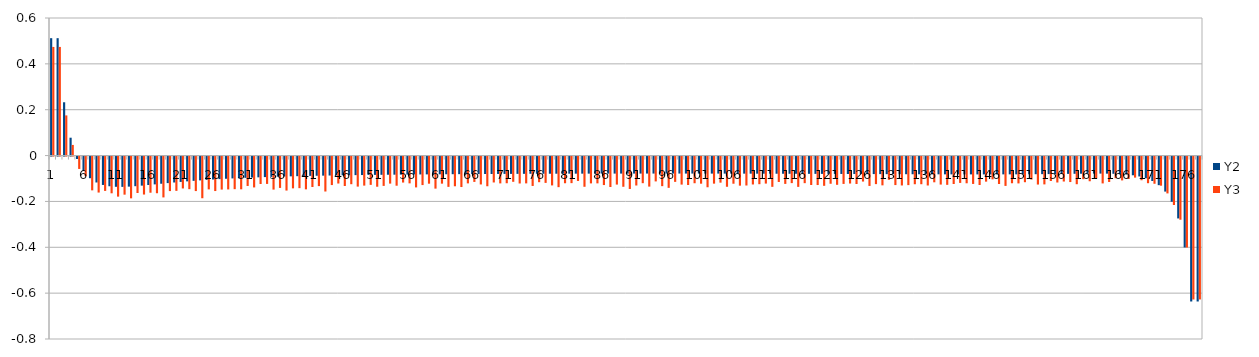
| Category | Y2 | Y3 |
|---|---|---|
| 0 | 0.512 | 0.474 |
| 1 | 0.512 | 0.474 |
| 2 | 0.232 | 0.175 |
| 3 | 0.078 | 0.046 |
| 4 | -0.011 | -0.054 |
| 5 | -0.063 | -0.086 |
| 6 | -0.094 | -0.147 |
| 7 | -0.113 | -0.157 |
| 8 | -0.124 | -0.15 |
| 9 | -0.129 | -0.16 |
| 10 | -0.132 | -0.175 |
| 11 | -0.132 | -0.166 |
| 12 | -0.131 | -0.182 |
| 13 | -0.129 | -0.159 |
| 14 | -0.127 | -0.166 |
| 15 | -0.124 | -0.158 |
| 16 | -0.121 | -0.16 |
| 17 | -0.118 | -0.178 |
| 18 | -0.116 | -0.151 |
| 19 | -0.113 | -0.15 |
| 20 | -0.111 | -0.139 |
| 21 | -0.108 | -0.142 |
| 22 | -0.106 | -0.15 |
| 23 | -0.104 | -0.182 |
| 24 | -0.102 | -0.143 |
| 25 | -0.1 | -0.15 |
| 26 | -0.098 | -0.144 |
| 27 | -0.097 | -0.143 |
| 28 | -0.095 | -0.142 |
| 29 | -0.094 | -0.143 |
| 30 | -0.093 | -0.128 |
| 31 | -0.092 | -0.135 |
| 32 | -0.091 | -0.12 |
| 33 | -0.09 | -0.119 |
| 34 | -0.089 | -0.144 |
| 35 | -0.088 | -0.137 |
| 36 | -0.087 | -0.148 |
| 37 | -0.086 | -0.139 |
| 38 | -0.086 | -0.138 |
| 39 | -0.085 | -0.143 |
| 40 | -0.084 | -0.133 |
| 41 | -0.084 | -0.129 |
| 42 | -0.083 | -0.152 |
| 43 | -0.083 | -0.124 |
| 44 | -0.082 | -0.118 |
| 45 | -0.082 | -0.128 |
| 46 | -0.081 | -0.121 |
| 47 | -0.081 | -0.131 |
| 48 | -0.081 | -0.127 |
| 49 | -0.08 | -0.123 |
| 50 | -0.08 | -0.132 |
| 51 | -0.08 | -0.128 |
| 52 | -0.079 | -0.118 |
| 53 | -0.079 | -0.127 |
| 54 | -0.079 | -0.113 |
| 55 | -0.078 | -0.117 |
| 56 | -0.078 | -0.134 |
| 57 | -0.078 | -0.124 |
| 58 | -0.078 | -0.118 |
| 59 | -0.078 | -0.14 |
| 60 | -0.077 | -0.118 |
| 61 | -0.077 | -0.132 |
| 62 | -0.077 | -0.13 |
| 63 | -0.077 | -0.133 |
| 64 | -0.077 | -0.117 |
| 65 | -0.076 | -0.111 |
| 66 | -0.076 | -0.122 |
| 67 | -0.076 | -0.129 |
| 68 | -0.076 | -0.113 |
| 69 | -0.076 | -0.117 |
| 70 | -0.076 | -0.116 |
| 71 | -0.076 | -0.11 |
| 72 | -0.075 | -0.117 |
| 73 | -0.075 | -0.117 |
| 74 | -0.075 | -0.128 |
| 75 | -0.075 | -0.112 |
| 76 | -0.075 | -0.115 |
| 77 | -0.075 | -0.126 |
| 78 | -0.075 | -0.133 |
| 79 | -0.075 | -0.116 |
| 80 | -0.075 | -0.116 |
| 81 | -0.075 | -0.106 |
| 82 | -0.075 | -0.132 |
| 83 | -0.074 | -0.117 |
| 84 | -0.074 | -0.117 |
| 85 | -0.074 | -0.124 |
| 86 | -0.074 | -0.133 |
| 87 | -0.074 | -0.122 |
| 88 | -0.074 | -0.132 |
| 89 | -0.074 | -0.141 |
| 90 | -0.074 | -0.126 |
| 91 | -0.074 | -0.116 |
| 92 | -0.074 | -0.131 |
| 93 | -0.074 | -0.108 |
| 94 | -0.074 | -0.129 |
| 95 | -0.074 | -0.136 |
| 96 | -0.074 | -0.11 |
| 97 | -0.074 | -0.122 |
| 98 | -0.074 | -0.124 |
| 99 | -0.074 | -0.116 |
| 100 | -0.074 | -0.118 |
| 101 | -0.074 | -0.134 |
| 102 | -0.074 | -0.118 |
| 103 | -0.074 | -0.114 |
| 104 | -0.074 | -0.132 |
| 105 | -0.074 | -0.118 |
| 106 | -0.074 | -0.127 |
| 107 | -0.075 | -0.126 |
| 108 | -0.075 | -0.122 |
| 109 | -0.075 | -0.12 |
| 110 | -0.075 | -0.118 |
| 111 | -0.075 | -0.132 |
| 112 | -0.075 | -0.111 |
| 113 | -0.075 | -0.119 |
| 114 | -0.075 | -0.116 |
| 115 | -0.075 | -0.132 |
| 116 | -0.075 | -0.116 |
| 117 | -0.075 | -0.124 |
| 118 | -0.075 | -0.124 |
| 119 | -0.076 | -0.128 |
| 120 | -0.076 | -0.119 |
| 121 | -0.076 | -0.123 |
| 122 | -0.076 | -0.119 |
| 123 | -0.076 | -0.118 |
| 124 | -0.076 | -0.12 |
| 125 | -0.076 | -0.109 |
| 126 | -0.076 | -0.128 |
| 127 | -0.076 | -0.12 |
| 128 | -0.077 | -0.126 |
| 129 | -0.077 | -0.101 |
| 130 | -0.077 | -0.124 |
| 131 | -0.077 | -0.126 |
| 132 | -0.077 | -0.124 |
| 133 | -0.077 | -0.121 |
| 134 | -0.077 | -0.121 |
| 135 | -0.077 | -0.126 |
| 136 | -0.077 | -0.112 |
| 137 | -0.077 | -0.122 |
| 138 | -0.078 | -0.123 |
| 139 | -0.078 | -0.12 |
| 140 | -0.078 | -0.115 |
| 141 | -0.078 | -0.117 |
| 142 | -0.078 | -0.119 |
| 143 | -0.078 | -0.124 |
| 144 | -0.078 | -0.109 |
| 145 | -0.078 | -0.099 |
| 146 | -0.078 | -0.12 |
| 147 | -0.078 | -0.128 |
| 148 | -0.078 | -0.116 |
| 149 | -0.077 | -0.117 |
| 150 | -0.077 | -0.112 |
| 151 | -0.077 | -0.1 |
| 152 | -0.077 | -0.122 |
| 153 | -0.077 | -0.121 |
| 154 | -0.076 | -0.107 |
| 155 | -0.076 | -0.113 |
| 156 | -0.076 | -0.109 |
| 157 | -0.075 | -0.111 |
| 158 | -0.075 | -0.121 |
| 159 | -0.075 | -0.099 |
| 160 | -0.075 | -0.108 |
| 161 | -0.074 | -0.095 |
| 162 | -0.074 | -0.117 |
| 163 | -0.075 | -0.111 |
| 164 | -0.075 | -0.094 |
| 165 | -0.076 | -0.104 |
| 166 | -0.078 | -0.098 |
| 167 | -0.082 | -0.092 |
| 168 | -0.087 | -0.103 |
| 169 | -0.095 | -0.116 |
| 170 | -0.106 | -0.119 |
| 171 | -0.125 | -0.127 |
| 172 | -0.153 | -0.161 |
| 173 | -0.197 | -0.211 |
| 174 | -0.27 | -0.276 |
| 175 | -0.396 | -0.397 |
| 176 | -0.632 | -0.623 |
| 177 | -0.632 | -0.623 |